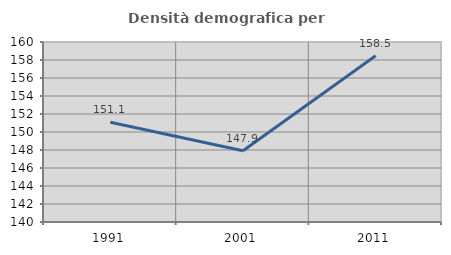
| Category | Densità demografica |
|---|---|
| 1991.0 | 151.078 |
| 2001.0 | 147.918 |
| 2011.0 | 158.474 |